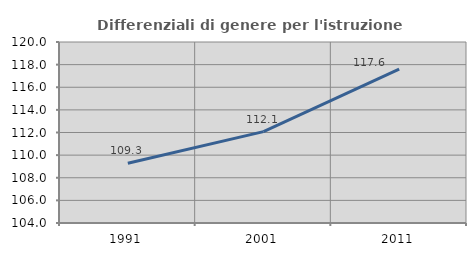
| Category | Differenziali di genere per l'istruzione superiore |
|---|---|
| 1991.0 | 109.283 |
| 2001.0 | 112.079 |
| 2011.0 | 117.604 |